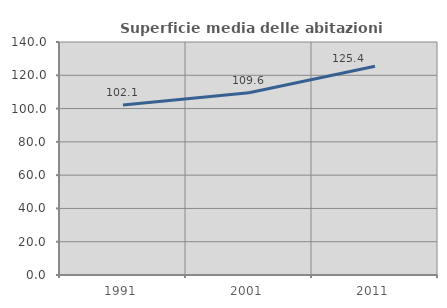
| Category | Superficie media delle abitazioni occupate |
|---|---|
| 1991.0 | 102.124 |
| 2001.0 | 109.551 |
| 2011.0 | 125.377 |